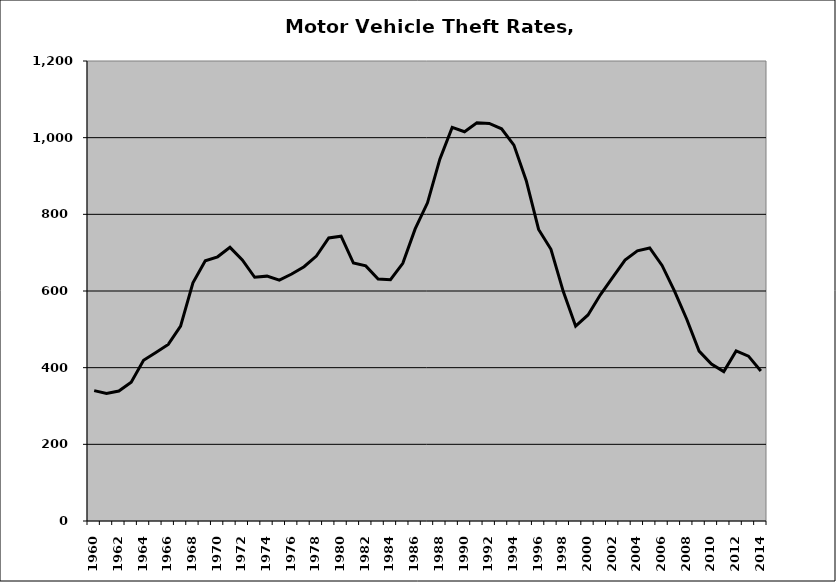
| Category | Motor Vehicle |
|---|---|
| 1960.0 | 340.092 |
| 1961.0 | 332.738 |
| 1962.0 | 339.157 |
| 1963.0 | 362.234 |
| 1964.0 | 419.083 |
| 1965.0 | 439.593 |
| 1966.0 | 460.704 |
| 1967.0 | 508.129 |
| 1968.0 | 621.424 |
| 1969.0 | 678.614 |
| 1970.0 | 689.185 |
| 1971.0 | 713.915 |
| 1972.0 | 681.259 |
| 1973.0 | 635.877 |
| 1974.0 | 638.776 |
| 1975.0 | 628.209 |
| 1976.0 | 644.284 |
| 1977.0 | 663.455 |
| 1978.0 | 691.253 |
| 1979.0 | 738.293 |
| 1980.0 | 742.941 |
| 1981.0 | 672.863 |
| 1982.0 | 665.467 |
| 1983.0 | 631.223 |
| 1984.0 | 629.572 |
| 1985.0 | 672.244 |
| 1986.0 | 762.007 |
| 1987.0 | 830.076 |
| 1988.0 | 944.025 |
| 1989.0 | 1026.89 |
| 1990.0 | 1015.503 |
| 1991.0 | 1038.891 |
| 1992.0 | 1037.069 |
| 1993.0 | 1023.021 |
| 1994.0 | 980.577 |
| 1995.0 | 887.901 |
| 1996.0 | 760.606 |
| 1997.0 | 708.82 |
| 1998.0 | 598.515 |
| 1999.0 | 508.31 |
| 2000.0 | 537.426 |
| 2001.0 | 590.099 |
| 2002.0 | 635.29 |
| 2003.0 | 680.506 |
| 2004.0 | 704.77 |
| 2005.0 | 712.347 |
| 2006.0 | 666.77 |
| 2007.0 | 600.18 |
| 2008.0 | 526.318 |
| 2009.0 | 443.251 |
| 2010.0 | 409.417 |
| 2011.0 | 389.667 |
| 2012.0 | 443.707 |
| 2013.0 | 430.096 |
| 2014.0 | 391.346 |